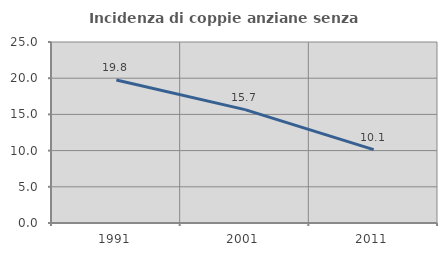
| Category | Incidenza di coppie anziane senza figli  |
|---|---|
| 1991.0 | 19.753 |
| 2001.0 | 15.663 |
| 2011.0 | 10.127 |